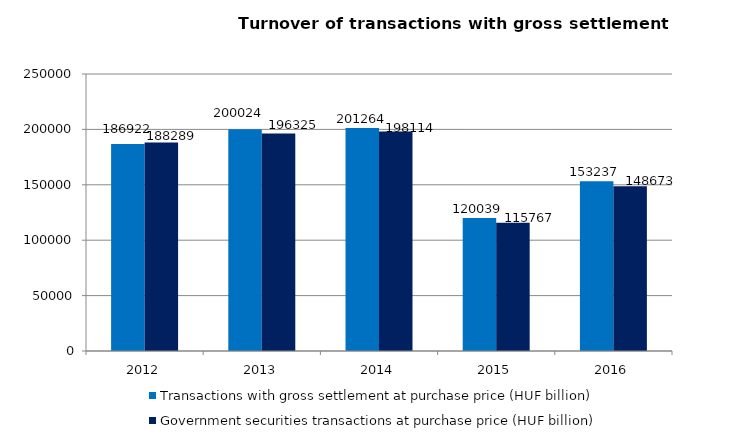
| Category | Transactions with gross settlement at purchase price (HUF billion) | Government securities transactions at purchase price (HUF billion) |
|---|---|---|
| 2012.0 | 186922 | 188289 |
| 2013.0 | 200024 | 196325 |
| 2014.0 | 201264 | 198114 |
| 2015.0 | 120039 | 115767 |
| 2016.0 | 153237 | 148673 |